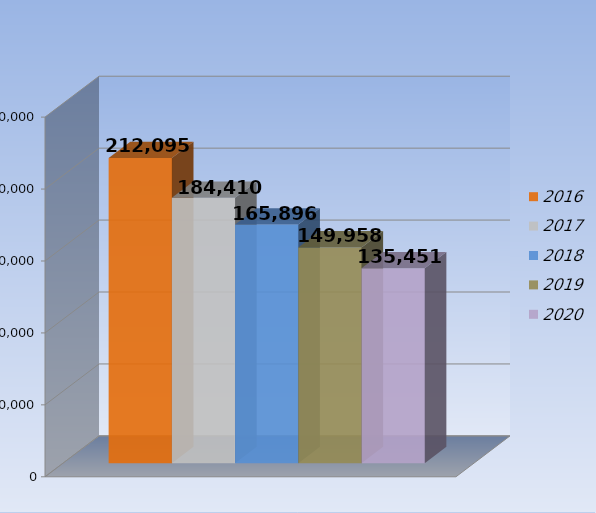
| Category | 2016 | 2017 | 2018 | 2019 | 2020 |
|---|---|---|---|---|---|
| 0 | 212095 | 184410 | 165896 | 149958 | 135451 |